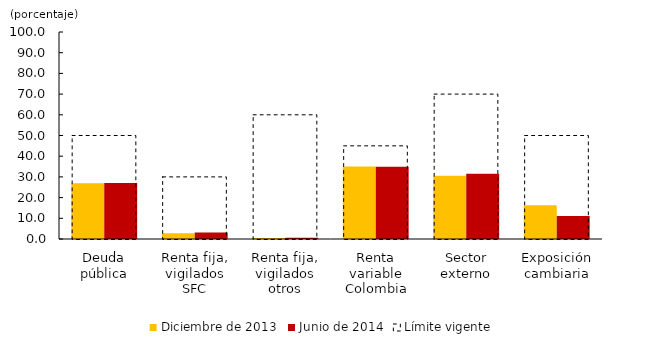
| Category | Diciembre de 2013 | Junio de 2014 |
|---|---|---|
| Deuda pública | 26.948 | 27.107 |
| Renta fija, vigilados SFC | 2.776 | 3.098 |
| Renta fija, vigilados otros | 0.497 | 0.587 |
| Renta variable Colombia | 34.972 | 34.863 |
| Sector externo | 30.613 | 31.5 |
| Exposición cambiaria | 16.325 | 11.16 |